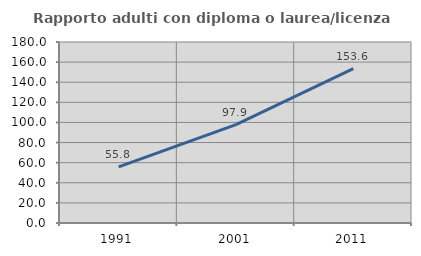
| Category | Rapporto adulti con diploma o laurea/licenza media  |
|---|---|
| 1991.0 | 55.8 |
| 2001.0 | 97.883 |
| 2011.0 | 153.605 |